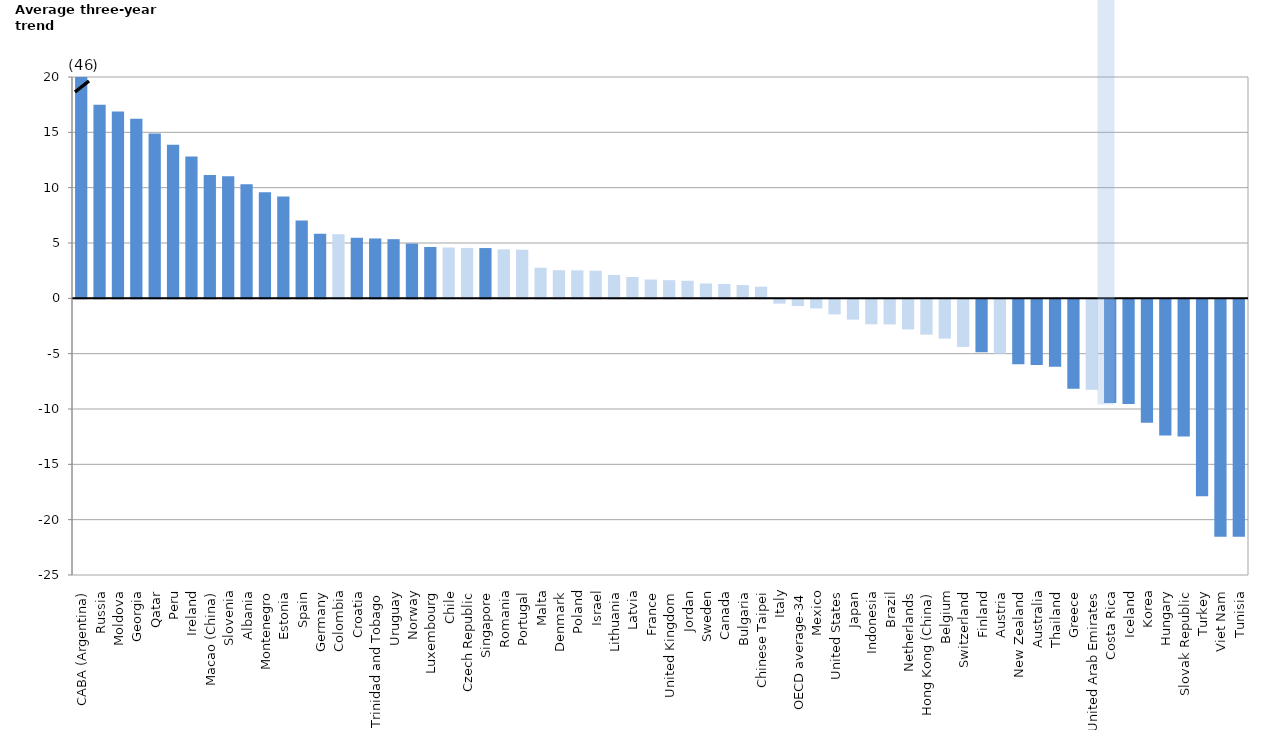
| Category | Annualised change in reading 
across PISA assessments | not sign |
|---|---|---|
| CABA (Argentina) | 46.045 | 0 |
| Russia | 17.488 | 0 |
| Moldova | 16.891 | 0 |
| Georgia | 16.217 | 0 |
| Qatar | 14.889 | 0 |
| Peru | 13.882 | 0 |
| Ireland | 12.813 | 0 |
| Macao (China) | 11.138 | 0 |
| Slovenia | 11.031 | 0 |
| Albania | 10.308 | 0 |
| Montenegro | 9.587 | 0 |
| Estonia | 9.21 | 0 |
| Spain | 7.043 | 0 |
| Germany | 5.838 | 0 |
| Colombia | 0 | 5.792 |
| Croatia | 5.473 | 0 |
| Trinidad and Tobago | 5.41 | 0 |
| Uruguay | 5.347 | 0 |
| Norway | 4.95 | 0 |
| Luxembourg | 4.641 | 0 |
| Chile | 0 | 4.589 |
| Czech Republic | 0 | 4.554 |
| Singapore | 4.543 | 0 |
| Romania | 0 | 4.42 |
| Portugal | 0 | 4.397 |
| Malta | 0 | 2.768 |
| Denmark | 0 | 2.54 |
| Poland | 0 | 2.528 |
| Israel | 0 | 2.496 |
| Lithuania | 0 | 2.113 |
| Latvia | 0 | 1.927 |
| France | 0 | 1.701 |
| United Kingdom | 0 | 1.638 |
| Jordan | 0 | 1.587 |
| Sweden | 0 | 1.344 |
| Canada | 0 | 1.294 |
| Bulgaria | 0 | 1.2 |
| Chinese Taipei | 0 | 1.052 |
| Italy | 0 | -0.39 |
| OECD average-34 | 0 | -0.61 |
| Mexico | 0 | -0.821 |
| United States | 0 | -1.361 |
| Japan | 0 | -1.834 |
| Indonesia | 0 | -2.256 |
| Brazil | 0 | -2.267 |
| Netherlands | 0 | -2.719 |
| Hong Kong (China) | 0 | -3.187 |
| Belgium | 0 | -3.55 |
| Switzerland | 0 | -4.3 |
| Finland | -4.783 | 0 |
| Austria | 0 | -4.897 |
| New Zealand | -5.868 | 0 |
| Australia | -5.925 | 0 |
| Thailand | -6.097 | 0 |
| Greece | -8.083 | 0 |
| United Arab Emirates | 0 | -8.161 |
| Costa Rica | -9.36 | 0 |
| Iceland | -9.45 | 0 |
| Korea | -11.141 | 0 |
| Hungary | -12.315 | 0 |
| Slovak Republic | -12.394 | 0 |
| Turkey | -17.791 | 0 |
| Viet Nam | -21.445 | 0 |
| Tunisia | -21.458 | 0 |